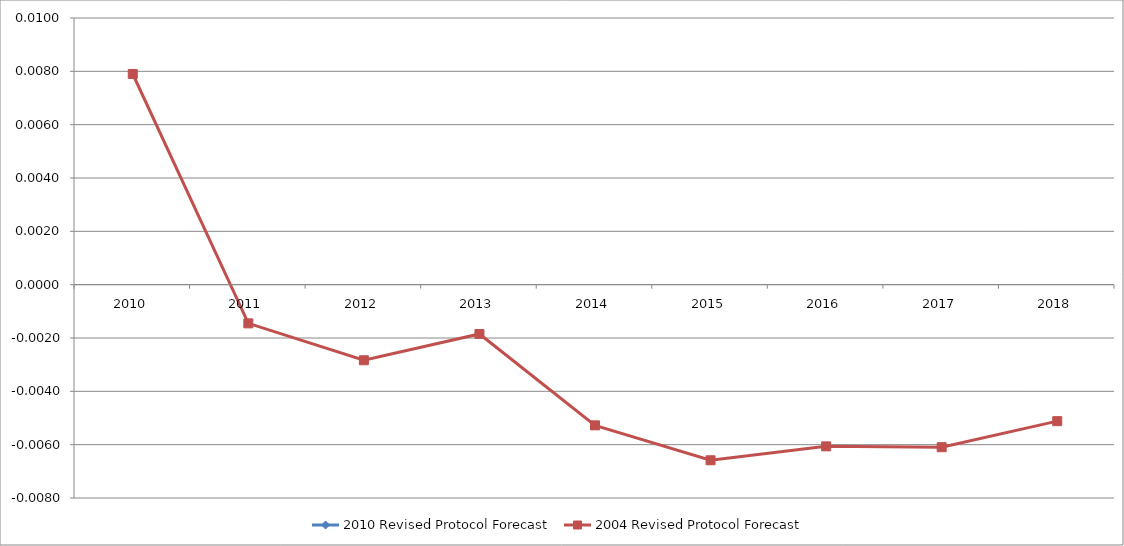
| Category | 2010 Revised Protocol Forecast | 2004 Revised Protocol Forecast |
|---|---|---|
| 2010.0 |  | 0.008 |
| 2011.0 |  | -0.001 |
| 2012.0 |  | -0.003 |
| 2013.0 |  | -0.002 |
| 2014.0 |  | -0.005 |
| 2015.0 |  | -0.007 |
| 2016.0 |  | -0.006 |
| 2017.0 |  | -0.006 |
| 2018.0 |  | -0.005 |